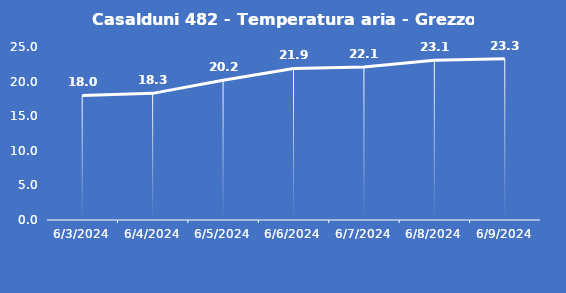
| Category | Casalduni 482 - Temperatura aria - Grezzo (°C) |
|---|---|
| 6/3/24 | 18 |
| 6/4/24 | 18.3 |
| 6/5/24 | 20.2 |
| 6/6/24 | 21.9 |
| 6/7/24 | 22.1 |
| 6/8/24 | 23.1 |
| 6/9/24 | 23.3 |